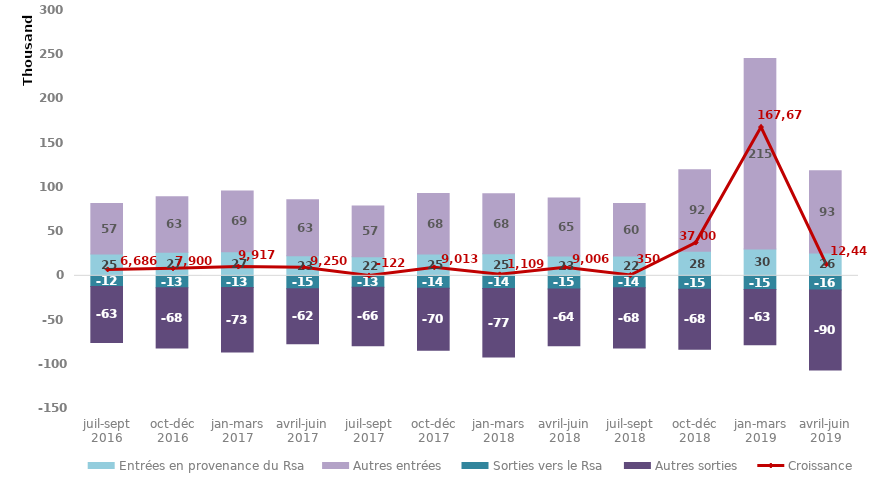
| Category | Entrées en provenance du Rsa | Autres entrées | Sorties vers le Rsa | Autres sorties |
|---|---|---|---|---|
| juil-sept 2016 | 24789 | 57108 | -12109 | -63132 |
| oct-déc 2016 | 26786 | 62748 | -13378 | -68228 |
| jan-mars 2017 | 27093 | 68961 | -13159 | -73010 |
| avril-juin 2017 | 22570 | 63473 | -14517 | -62321 |
| juil-sept 2017 | 21686 | 57142 | -12877 | -66092 |
| oct-déc 2017 | 24785 | 68247 | -14101 | -69939 |
| jan-mars 2018 | 25085 | 67623 | -14445 | -77185 |
| avril-juin 2018 | 22533 | 65493 | -14855 | -64184 |
| juil-sept 2018 | 22297 | 59564 | -13566 | -67949 |
| oct-déc 2018 | 27860 | 92126 | -15276 | -67730 |
| jan-mars 2019 | 30314 | 215317 | -15335 | -62557 |
| avril-juin 2019 | 25926 | 92845 | -16127 | -90244 |